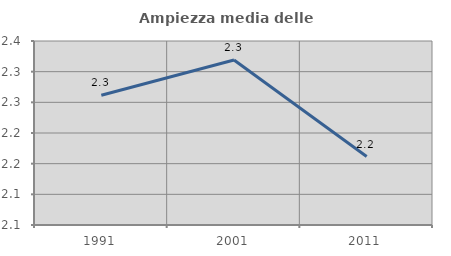
| Category | Ampiezza media delle famiglie |
|---|---|
| 1991.0 | 2.262 |
| 2001.0 | 2.319 |
| 2011.0 | 2.162 |